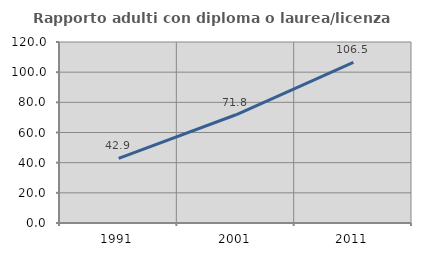
| Category | Rapporto adulti con diploma o laurea/licenza media  |
|---|---|
| 1991.0 | 42.857 |
| 2001.0 | 71.756 |
| 2011.0 | 106.452 |